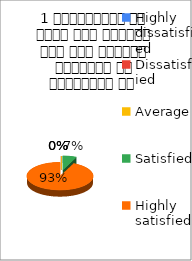
| Category | 1 व्याख्यान से रूचि में वृद्धि हुई एवं शिक्षण जानकारी से परिपूर्ण था  |
|---|---|
| Highly dissatisfied | 0 |
| Dissatisfied | 0 |
| Average | 0 |
| Satisfied | 1 |
| Highly satisfied | 14 |